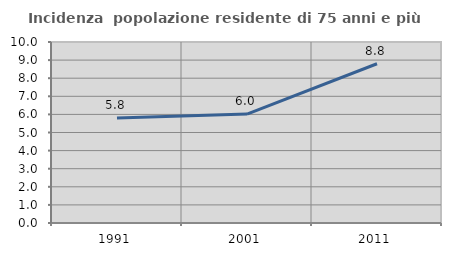
| Category | Incidenza  popolazione residente di 75 anni e più |
|---|---|
| 1991.0 | 5.796 |
| 2001.0 | 6.018 |
| 2011.0 | 8.798 |